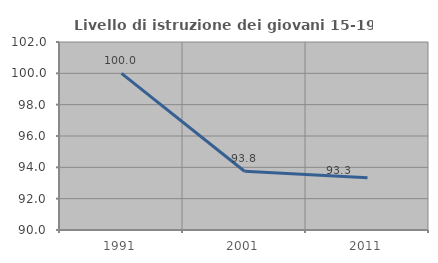
| Category | Livello di istruzione dei giovani 15-19 anni |
|---|---|
| 1991.0 | 100 |
| 2001.0 | 93.75 |
| 2011.0 | 93.333 |